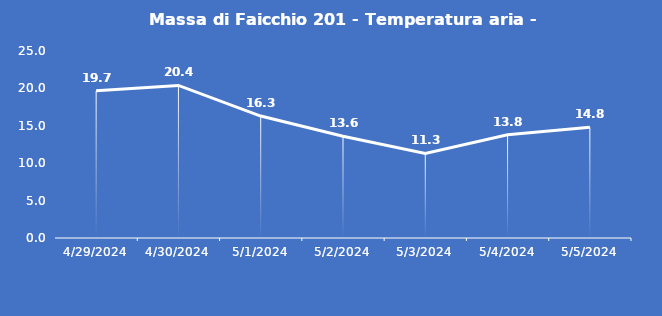
| Category | Massa di Faicchio 201 - Temperatura aria - Grezzo (°C) |
|---|---|
| 4/29/24 | 19.7 |
| 4/30/24 | 20.4 |
| 5/1/24 | 16.3 |
| 5/2/24 | 13.6 |
| 5/3/24 | 11.3 |
| 5/4/24 | 13.8 |
| 5/5/24 | 14.8 |